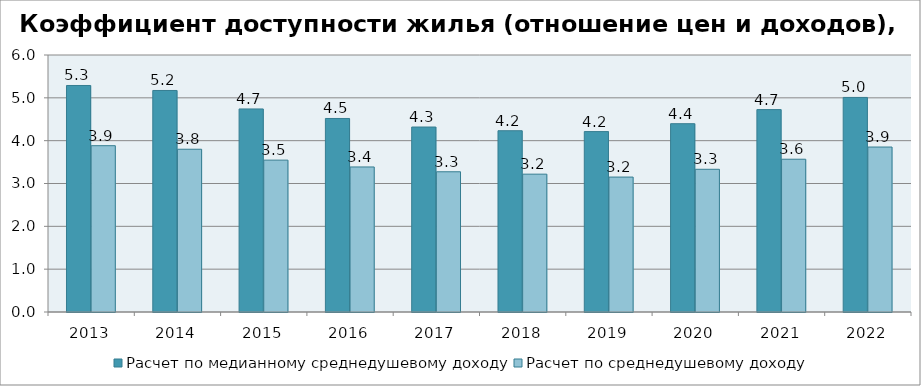
| Category | Расчет по медианному среднедушевому доходу | Расчет по среднедушевому доходу |
|---|---|---|
| 2013 | 5.288 | 3.883 |
| 2014 | 5.172 | 3.8 |
| 2015 | 4.741 | 3.546 |
| 2016 | 4.518 | 3.386 |
| 2017 | 4.318 | 3.274 |
| 2018 | 4.232 | 3.218 |
| 2019 | 4.212 | 3.15 |
| 2020 | 4.396 | 3.332 |
| 2021 | 4.725 | 3.567 |
| 2022 | 5.009 | 3.851 |